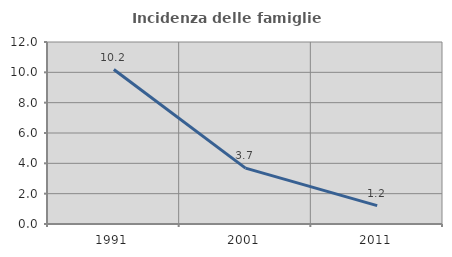
| Category | Incidenza delle famiglie numerose |
|---|---|
| 1991.0 | 10.182 |
| 2001.0 | 3.687 |
| 2011.0 | 1.214 |